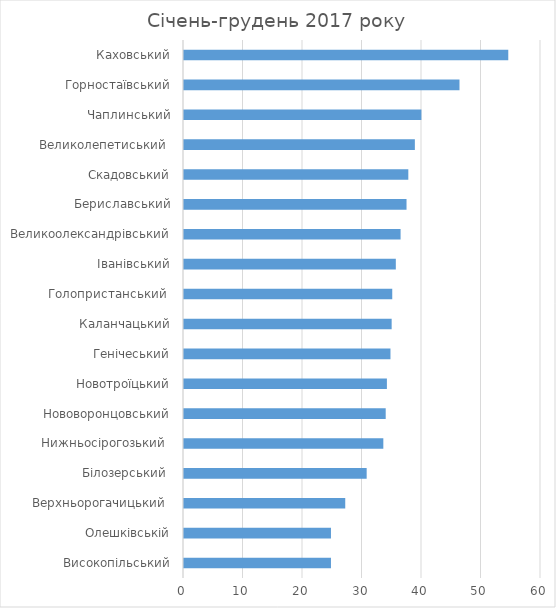
| Category | Series 0 |
|---|---|
| Високопільський | 24.7 |
| Олешківській | 24.7 |
| Верхньорогачицький  | 27.1 |
| Білозерський  | 30.7 |
| Нижньосірогозький  | 33.5 |
| Нововоронцовський | 33.9 |
| Новотроїцький | 34.1 |
| Генічеський | 34.7 |
| Каланчацький | 34.9 |
| Голопристанський  | 35 |
| Іванівський | 35.6 |
| Великоолександрівський | 36.4 |
| Бериславський | 37.4 |
| Скадовський | 37.7 |
| Великолепетиський  | 38.8 |
| Чаплинський | 39.9 |
| Горностаївський | 46.3 |
| Каховський | 54.5 |